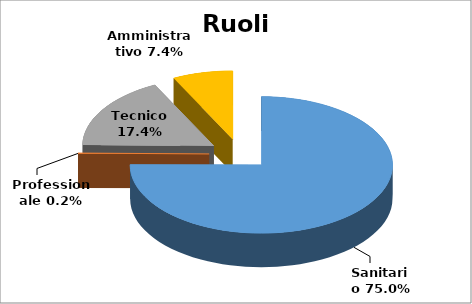
| Category | Series 0 |
|---|---|
| Sanitario | 0.75 |
| Professionale | 0.002 |
| Tecnico | 0.174 |
| Amministrativo | 0.074 |